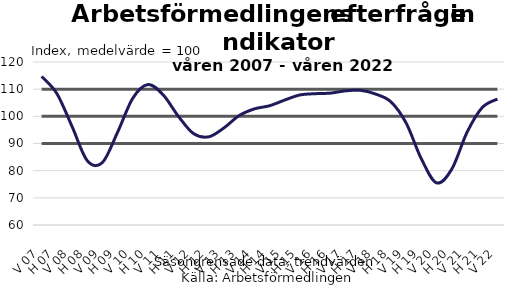
| Category | Mycket svagare än normalt | Normalt | Mycket starkare än normalt | Arbetsförmedlingens efterfrågeindikator |
|---|---|---|---|---|
| V 07 | 90 | 100 | 110 | 114.68 |
| H 07 | 90 | 100 | 110 | 108.43 |
| V 08 | 90 | 100 | 110 | 96.33 |
| H 08 | 90 | 100 | 110 | 83.72 |
| V 09 | 90 | 100 | 110 | 82.99 |
| H 09 | 90 | 100 | 110 | 94.13 |
| V 10 | 90 | 100 | 110 | 106.65 |
| H 10 | 90 | 100 | 110 | 111.7 |
| V 11 | 90 | 100 | 110 | 107.92 |
| H 11 | 90 | 100 | 110 | 100.03 |
| V 12 | 90 | 100 | 110 | 93.66 |
| H 12 | 90 | 100 | 110 | 92.46 |
| V 13 | 90 | 100 | 110 | 95.73 |
| H 13 | 90 | 100 | 110 | 100.27 |
| V 14 | 90 | 100 | 110 | 102.74 |
| H 14 | 90 | 100 | 110 | 103.89 |
| V 15 | 90 | 100 | 110 | 105.99 |
| H 15 | 90 | 100 | 110 | 107.87 |
| V 16 | 90 | 100 | 110 | 108.33 |
| H 16 | 90 | 100 | 110 | 108.54 |
| V 17 | 90 | 100 | 110 | 109.37 |
| H 17 | 90 | 100 | 110 | 109.57 |
| V 18 | 90 | 100 | 110 | 108.17 |
| H 18 | 90 | 100 | 110 | 105.29 |
| V 19 | 90 | 100 | 110 | 97.47 |
| H 19 | 90 | 100 | 110 | 84.27 |
| V 20 | 90 | 100 | 110 | 75.51 |
| H 20 | 90 | 100 | 110 | 80.6 |
| V 21 | 90 | 100 | 110 | 94.11 |
| H 21 | 90 | 100 | 110 | 103.23 |
| V 22 | 90 | 100 | 110 | 106.37 |